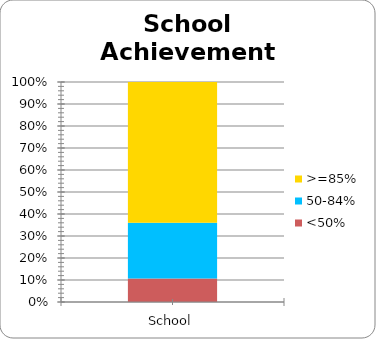
| Category | <50% | 50-84% | >=85% |
|---|---|---|---|
| School | 269 | 641 | 1613 |